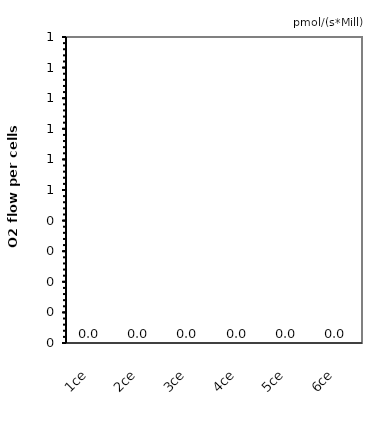
| Category | pmol/(s*Mill) |
|---|---|
| 1ce | 0 |
| 2ce | 0 |
| 3ce | 0 |
| 4ce | 0 |
| 5ce | 0 |
| 6ce | 0 |